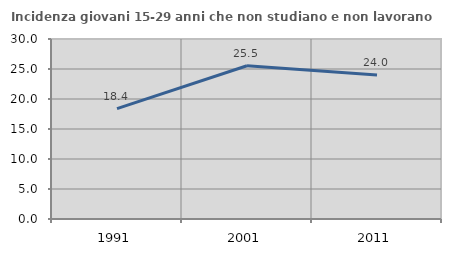
| Category | Incidenza giovani 15-29 anni che non studiano e non lavorano  |
|---|---|
| 1991.0 | 18.389 |
| 2001.0 | 25.54 |
| 2011.0 | 23.986 |